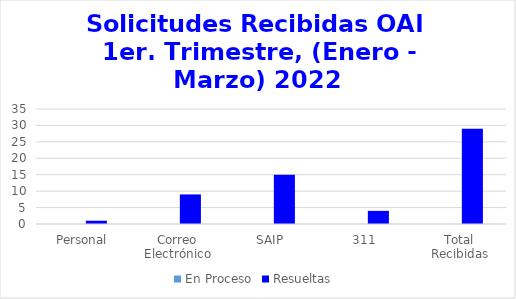
| Category | En Proceso | Resueltas  |
|---|---|---|
| Personal | 0 | 1 |
| Correo Electrónico | 0 | 9 |
| SAIP | 0 | 15 |
| 311 | 0 | 4 |
| Total Recibidas | 0 | 29 |